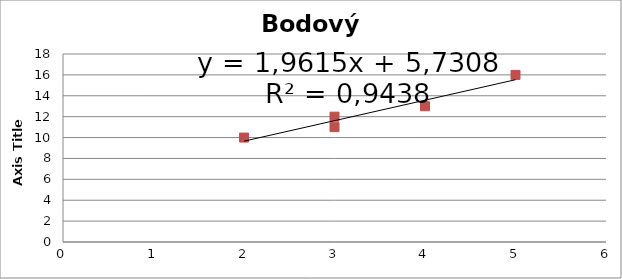
| Category | Series 1 |
|---|---|
| 2.0 | 10 |
| 3.0 | 12 |
| 3.0 | 11 |
| 4.0 | 13 |
| 5.0 | 16 |